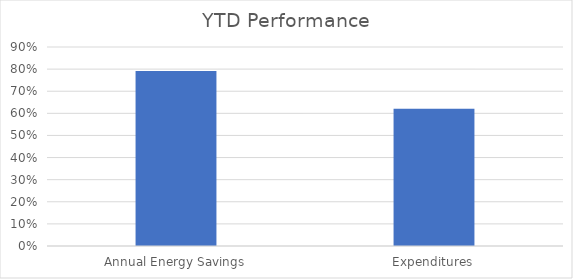
| Category | YTD Performance |
|---|---|
| Annual Energy Savings | 0.792 |
| Expenditures | 0.621 |